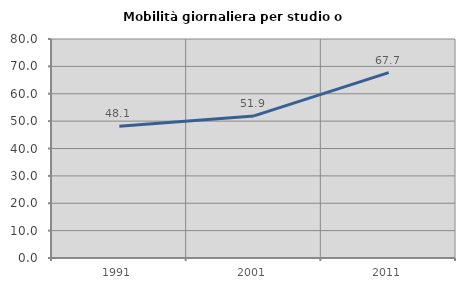
| Category | Mobilità giornaliera per studio o lavoro |
|---|---|
| 1991.0 | 48.101 |
| 2001.0 | 51.899 |
| 2011.0 | 67.742 |